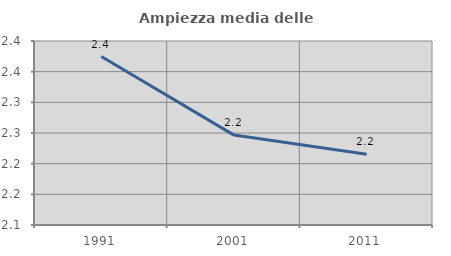
| Category | Ampiezza media delle famiglie |
|---|---|
| 1991.0 | 2.375 |
| 2001.0 | 2.247 |
| 2011.0 | 2.215 |